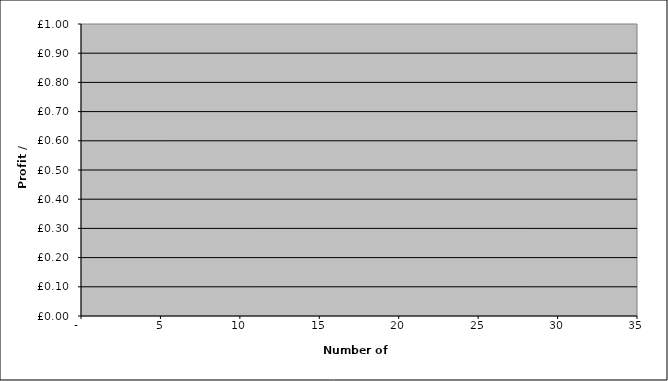
| Category | Series 0 |
|---|---|
| 24.0 | 0 |
| 25.0 | 0 |
| 25.0 | 0 |
| 26.0 | 0 |
| 26.0 | 0 |
| 27.0 | 0 |
| 28.0 | 0 |
| 28.0 | 0 |
| 29.0 | 0 |
| 29.0 | 0 |
| 30.0 | 0 |